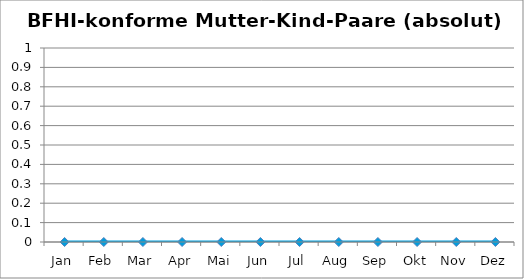
| Category | Series 0 |
|---|---|
| Jan | 0 |
| Feb | 0 |
| Mar | 0 |
| Apr | 0 |
| Mai | 0 |
| Jun | 0 |
| Jul | 0 |
| Aug | 0 |
| Sep | 0 |
| Okt | 0 |
| Nov | 0 |
| Dez | 0 |